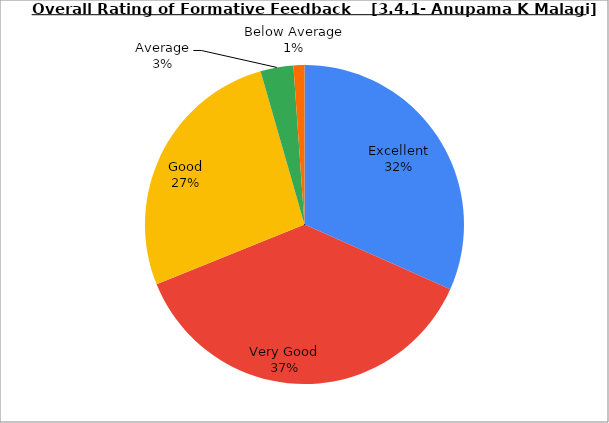
| Category | Series 0 |
|---|---|
| Excellent | 31.667 |
| Very Good | 37.222 |
| Good | 26.667 |
| Average | 3.333 |
| Below Average | 1.111 |